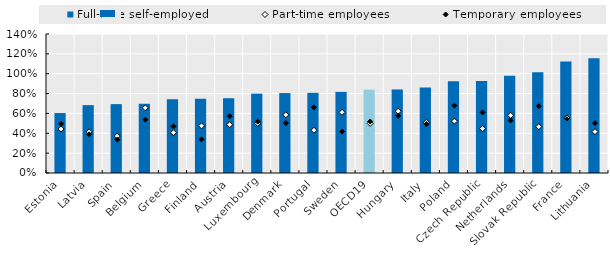
| Category | Full-time self-employed |
|---|---|
| Estonia | 0.604 |
| Latvia | 0.683 |
| Spain | 0.694 |
| Belgium | 0.697 |
| Greece | 0.742 |
| Finland | 0.748 |
| Austria | 0.753 |
| Luxembourg | 0.799 |
| Denmark | 0.805 |
| Portugal | 0.807 |
| Sweden | 0.817 |
| OECD19 | 0.839 |
| Hungary | 0.841 |
| Italy | 0.861 |
| Poland | 0.924 |
| Czech Republic | 0.925 |
| Netherlands | 0.98 |
| Slovak Republic | 1.015 |
| France | 1.122 |
| Lithuania | 1.156 |